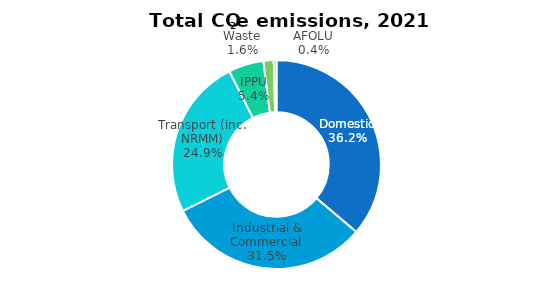
| Category | Series 0 |
|---|---|
| Domestic | 10.369 |
| Industrial & Commercial | 9.038 |
| Transport (inc. NRMM) | 7.128 |
| IPPU | 1.561 |
| Waste | 0.456 |
| AFOLU | 0.119 |